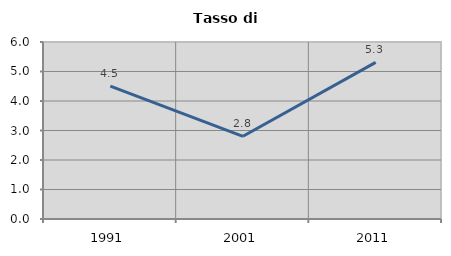
| Category | Tasso di disoccupazione   |
|---|---|
| 1991.0 | 4.505 |
| 2001.0 | 2.804 |
| 2011.0 | 5.31 |